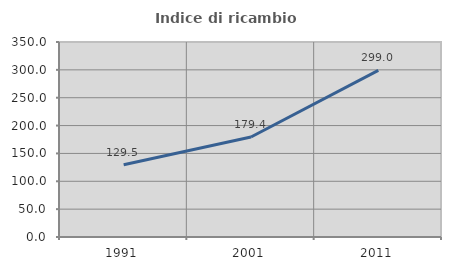
| Category | Indice di ricambio occupazionale  |
|---|---|
| 1991.0 | 129.545 |
| 2001.0 | 179.433 |
| 2011.0 | 299 |